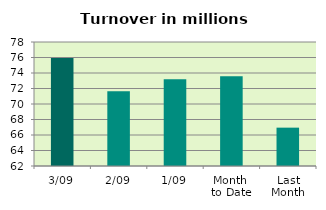
| Category | Series 0 |
|---|---|
| 3/09 | 75.927 |
| 2/09 | 71.631 |
| 1/09 | 73.203 |
| Month 
to Date | 73.587 |
| Last
Month | 66.948 |